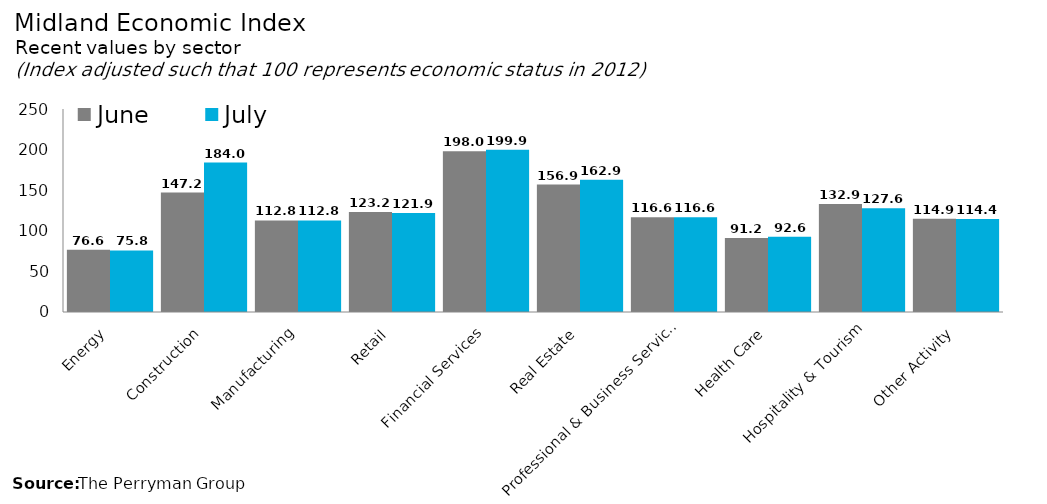
| Category | June | July |
|---|---|---|
| Energy | 76.617 | 75.769 |
| Construction | 147.152 | 183.996 |
| Manufacturing | 112.771 | 112.771 |
| Retail | 123.209 | 121.925 |
| Financial Services | 198.001 | 199.942 |
| Real Estate | 156.908 | 162.904 |
| Professional & Business Services | 116.621 | 116.621 |
| Health Care | 91.244 | 92.627 |
| Hospitality & Tourism | 132.895 | 127.632 |
| Other Activity | 114.914 | 114.443 |